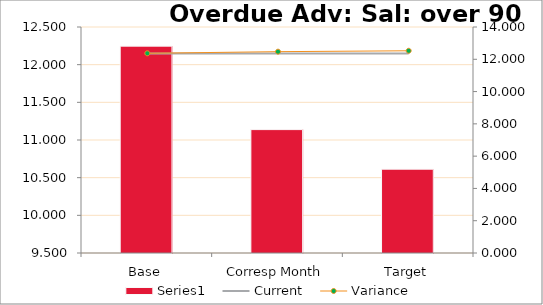
| Category | Series 0 |
|---|---|
| Base | 12.246 |
| Corresp Month | 11.138 |
| Target | 10.613 |